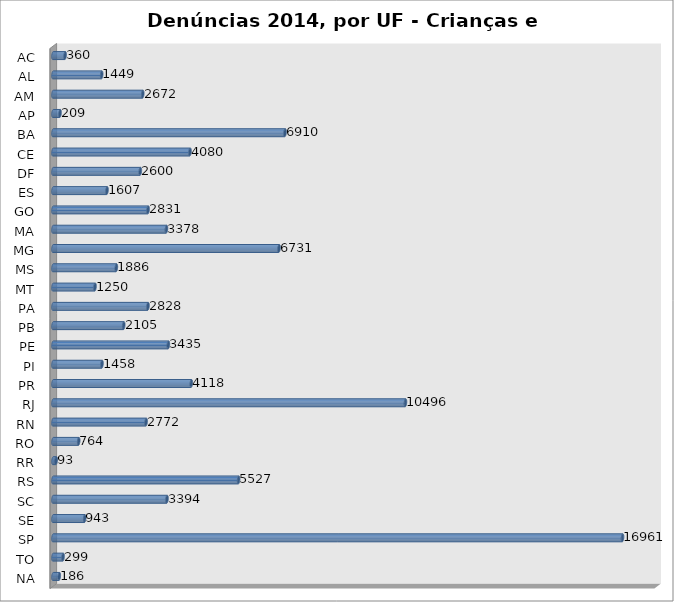
| Category | Series 0 |
|---|---|
| AC | 360 |
| AL | 1449 |
| AM | 2672 |
| AP | 209 |
| BA | 6910 |
| CE | 4080 |
| DF | 2600 |
| ES | 1607 |
| GO | 2831 |
| MA | 3378 |
| MG | 6731 |
| MS | 1886 |
| MT | 1250 |
| PA | 2828 |
| PB | 2105 |
| PE | 3435 |
| PI | 1458 |
| PR | 4118 |
| RJ | 10496 |
| RN | 2772 |
| RO | 764 |
| RR | 93 |
| RS | 5527 |
| SC | 3394 |
| SE | 943 |
| SP | 16961 |
| TO | 299 |
| NA | 186 |